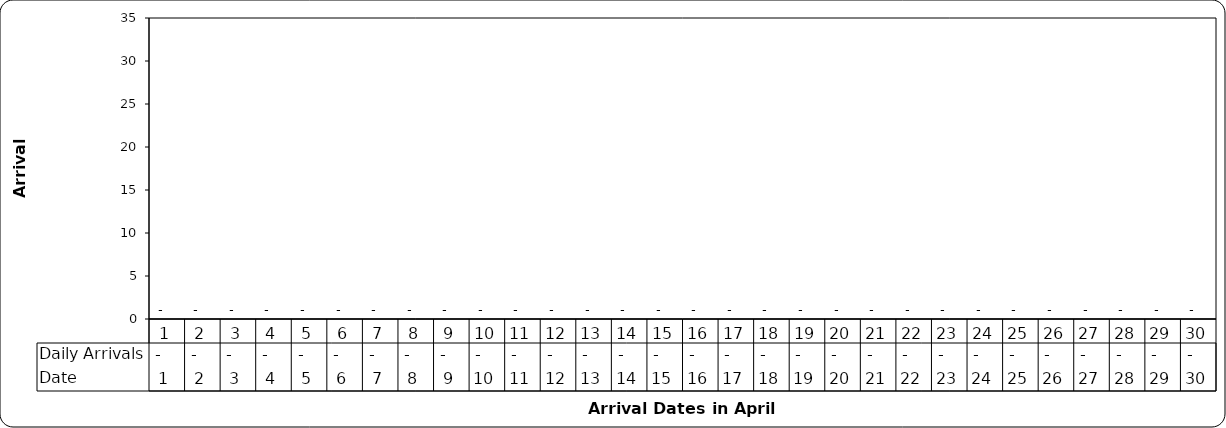
| Category | Daily Arrivals |
|---|---|
| 0 | 0 |
| 1 | 0 |
| 2 | 0 |
| 3 | 0 |
| 4 | 0 |
| 5 | 0 |
| 6 | 0 |
| 7 | 0 |
| 8 | 0 |
| 9 | 0 |
| 10 | 0 |
| 11 | 0 |
| 12 | 0 |
| 13 | 0 |
| 14 | 0 |
| 15 | 0 |
| 16 | 0 |
| 17 | 0 |
| 18 | 0 |
| 19 | 0 |
| 20 | 0 |
| 21 | 0 |
| 22 | 0 |
| 23 | 0 |
| 24 | 0 |
| 25 | 0 |
| 26 | 0 |
| 27 | 0 |
| 28 | 0 |
| 29 | 0 |